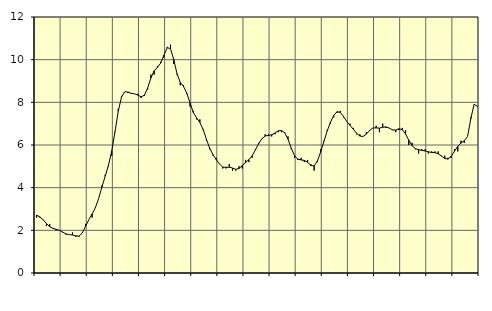
| Category | Piggar | Series 1 |
|---|---|---|
| nan | 2.6 | 2.71 |
| 87.0 | 2.6 | 2.63 |
| 87.0 | 2.5 | 2.49 |
| 87.0 | 2.2 | 2.32 |
| nan | 2.3 | 2.17 |
| 88.0 | 2.1 | 2.09 |
| 88.0 | 2 | 2.05 |
| 88.0 | 2 | 2 |
| nan | 1.9 | 1.92 |
| 89.0 | 1.8 | 1.83 |
| 89.0 | 1.8 | 1.8 |
| 89.0 | 1.9 | 1.78 |
| nan | 1.7 | 1.74 |
| 90.0 | 1.7 | 1.73 |
| 90.0 | 1.9 | 1.88 |
| 90.0 | 2.3 | 2.19 |
| nan | 2.5 | 2.5 |
| 91.0 | 2.6 | 2.77 |
| 91.0 | 3.1 | 3.06 |
| 91.0 | 3.5 | 3.5 |
| nan | 4.1 | 4.03 |
| 92.0 | 4.6 | 4.54 |
| 92.0 | 5 | 5.05 |
| 92.0 | 5.5 | 5.71 |
| nan | 6.6 | 6.62 |
| 93.0 | 7.7 | 7.58 |
| 93.0 | 8.3 | 8.25 |
| 93.0 | 8.5 | 8.5 |
| nan | 8.5 | 8.47 |
| 94.0 | 8.4 | 8.42 |
| 94.0 | 8.4 | 8.4 |
| 94.0 | 8.4 | 8.34 |
| nan | 8.2 | 8.26 |
| 95.0 | 8.3 | 8.33 |
| 95.0 | 8.6 | 8.67 |
| 95.0 | 9.3 | 9.14 |
| nan | 9.3 | 9.48 |
| 96.0 | 9.7 | 9.64 |
| 96.0 | 9.9 | 9.84 |
| 96.0 | 10.1 | 10.21 |
| nan | 10.6 | 10.56 |
| 97.0 | 10.7 | 10.52 |
| 97.0 | 9.8 | 10 |
| 97.0 | 9.3 | 9.34 |
| nan | 8.8 | 8.94 |
| 98.0 | 8.8 | 8.74 |
| 98.0 | 8.4 | 8.43 |
| 98.0 | 7.8 | 7.97 |
| nan | 7.6 | 7.52 |
| 99.0 | 7.2 | 7.27 |
| 99.0 | 7.2 | 7.06 |
| 99.0 | 6.7 | 6.73 |
| nan | 6.2 | 6.27 |
| 0.0 | 5.8 | 5.85 |
| 0.0 | 5.5 | 5.55 |
| 0.0 | 5.4 | 5.32 |
| nan | 5.1 | 5.11 |
| 1.0 | 4.9 | 4.97 |
| 1.0 | 4.9 | 4.95 |
| 1.0 | 5.1 | 4.96 |
| nan | 4.8 | 4.92 |
| 2.0 | 4.8 | 4.86 |
| 2.0 | 5 | 4.9 |
| 2.0 | 4.9 | 5.04 |
| nan | 5.3 | 5.18 |
| 3.0 | 5.2 | 5.31 |
| 3.0 | 5.4 | 5.49 |
| 3.0 | 5.8 | 5.77 |
| nan | 6.1 | 6.06 |
| 4.0 | 6.3 | 6.29 |
| 4.0 | 6.5 | 6.42 |
| 4.0 | 6.5 | 6.45 |
| nan | 6.4 | 6.48 |
| 5.0 | 6.5 | 6.56 |
| 5.0 | 6.6 | 6.66 |
| 5.0 | 6.6 | 6.68 |
| nan | 6.6 | 6.57 |
| 6.0 | 6.4 | 6.27 |
| 6.0 | 5.8 | 5.85 |
| 6.0 | 5.4 | 5.5 |
| nan | 5.3 | 5.34 |
| 7.0 | 5.4 | 5.3 |
| 7.0 | 5.2 | 5.28 |
| 7.0 | 5.3 | 5.19 |
| nan | 5.1 | 5.04 |
| 8.0 | 4.8 | 5.02 |
| 8.0 | 5.2 | 5.25 |
| 8.0 | 5.8 | 5.68 |
| nan | 6.2 | 6.17 |
| 9.0 | 6.7 | 6.66 |
| 9.0 | 7 | 7.07 |
| 9.0 | 7.3 | 7.38 |
| nan | 7.5 | 7.56 |
| 10.0 | 7.6 | 7.53 |
| 10.0 | 7.3 | 7.34 |
| 10.0 | 7.1 | 7.1 |
| nan | 7 | 6.92 |
| 11.0 | 6.8 | 6.74 |
| 11.0 | 6.5 | 6.55 |
| 11.0 | 6.5 | 6.42 |
| nan | 6.4 | 6.4 |
| 12.0 | 6.6 | 6.51 |
| 12.0 | 6.7 | 6.68 |
| 12.0 | 6.8 | 6.8 |
| nan | 6.9 | 6.8 |
| 13.0 | 6.6 | 6.79 |
| 13.0 | 7 | 6.83 |
| 13.0 | 6.8 | 6.85 |
| nan | 6.8 | 6.79 |
| 14.0 | 6.7 | 6.71 |
| 14.0 | 6.6 | 6.7 |
| 14.0 | 6.7 | 6.76 |
| nan | 6.8 | 6.72 |
| 15.0 | 6.7 | 6.52 |
| 15.0 | 6 | 6.22 |
| 15.0 | 6.1 | 5.97 |
| nan | 5.8 | 5.83 |
| 16.0 | 5.6 | 5.78 |
| 16.0 | 5.8 | 5.75 |
| 16.0 | 5.8 | 5.72 |
| nan | 5.6 | 5.68 |
| 17.0 | 5.7 | 5.65 |
| 17.0 | 5.7 | 5.64 |
| 17.0 | 5.7 | 5.59 |
| nan | 5.5 | 5.48 |
| 18.0 | 5.5 | 5.37 |
| 18.0 | 5.4 | 5.34 |
| 18.0 | 5.4 | 5.47 |
| nan | 5.8 | 5.71 |
| 19.0 | 5.7 | 5.94 |
| 19.0 | 6.2 | 6.09 |
| 19.0 | 6.1 | 6.2 |
| nan | 6.4 | 6.4 |
| 20.0 | 7.3 | 7.24 |
| 20.0 | 7.9 | 7.91 |
| 20.0 | 7.8 | 7.81 |